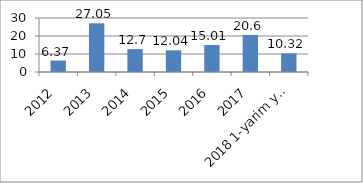
| Category | Series 0 |
|---|---|
| 2012 | 6.37 |
| 2013 | 27.05 |
| 2014 | 12.7 |
| 2015 | 12.04 |
| 2016 | 15.01 |
| 2017 | 20.6 |
| 2018 1-yarim yillik | 10.32 |